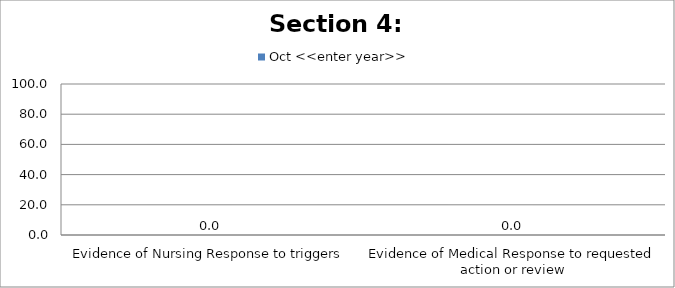
| Category | Oct <<enter year>> |
|---|---|
| Evidence of Nursing Response to triggers | 0 |
| Evidence of Medical Response to requested action or review | 0 |